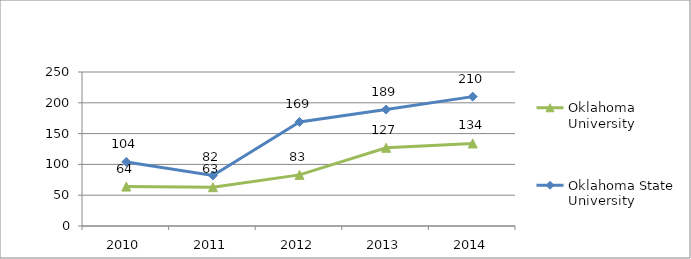
| Category | Oklahoma University | Oklahoma State University |
|---|---|---|
| 2010.0 | 64 | 104 |
| 2011.0 | 63 | 82 |
| 2012.0 | 83 | 169 |
| 2013.0 | 127 | 189 |
| 2014.0 | 134 | 210 |